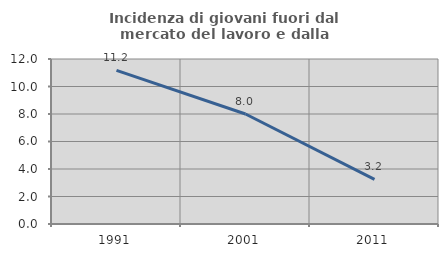
| Category | Incidenza di giovani fuori dal mercato del lavoro e dalla formazione  |
|---|---|
| 1991.0 | 11.173 |
| 2001.0 | 8 |
| 2011.0 | 3.247 |